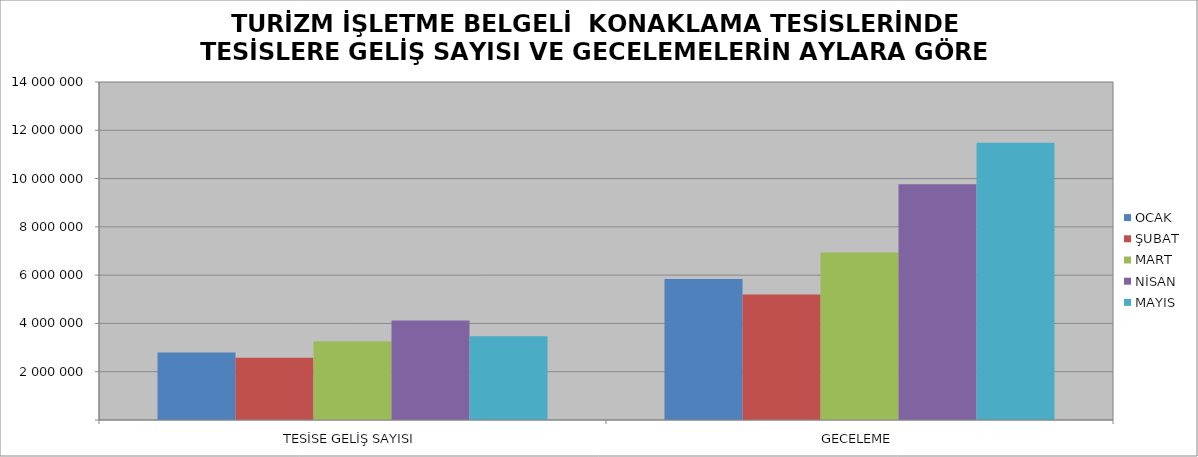
| Category | OCAK | ŞUBAT | MART | NİSAN | MAYIS |
|---|---|---|---|---|---|
| TESİSE GELİŞ SAYISI | 2792196 | 2573999 | 3258929 | 4119434 | 3468117 |
| GECELEME | 5837753 | 5199578 | 6939659 | 9767435 | 11484758 |